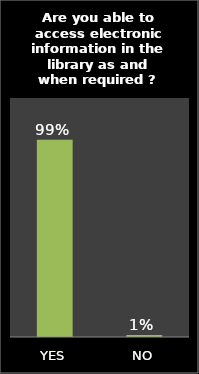
| Category | Series 0 |
|---|---|
| YES | 0.99 |
| NO | 0.01 |